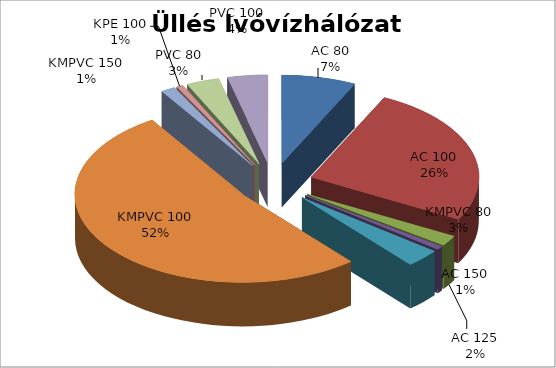
| Category | Series 0 |
|---|---|
| AC 80 | 1411 |
| AC 100 | 5086 |
| AC 125 | 374 |
| AC 150 | 126 |
| KMPVC 80 | 656 |
| KMPVC 100 | 10277 |
| KMPVC 150 | 272 |
| KPE 100 | 127 |
| PVC 80 | 626 |
| PVC 100 | 764 |